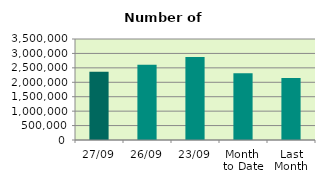
| Category | Series 0 |
|---|---|
| 27/09 | 2361406 |
| 26/09 | 2611168 |
| 23/09 | 2876840 |
| Month 
to Date | 2313096.737 |
| Last
Month | 2149140 |